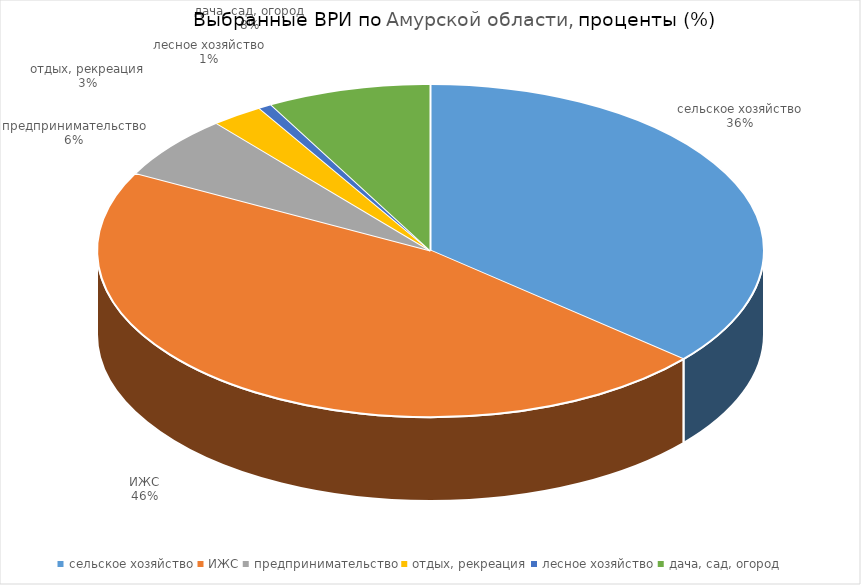
| Category | Амурская область |
|---|---|
| сельское хозяйство | 36.301 |
| ИЖС | 46.413 |
| предпринимательство | 6.18 |
| отдых, рекреация | 2.506 |
| лесное хозяйство | 0.648 |
| дача, сад, огород | 7.952 |